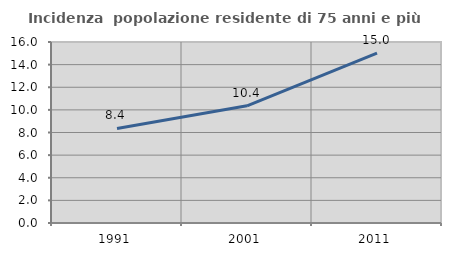
| Category | Incidenza  popolazione residente di 75 anni e più |
|---|---|
| 1991.0 | 8.358 |
| 2001.0 | 10.357 |
| 2011.0 | 15.024 |